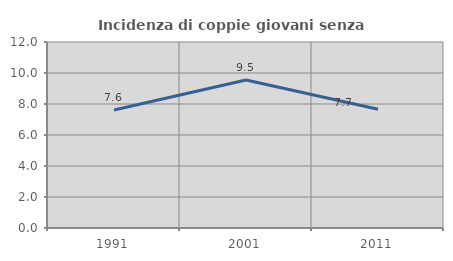
| Category | Incidenza di coppie giovani senza figli |
|---|---|
| 1991.0 | 7.61 |
| 2001.0 | 9.547 |
| 2011.0 | 7.66 |